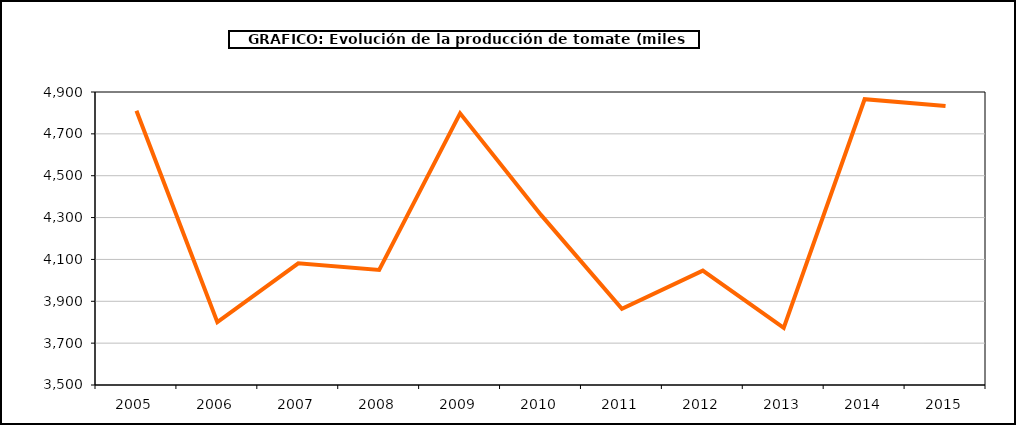
| Category | producción |
|---|---|
| 2005.0 | 4810.301 |
| 2006.0 | 3800.552 |
| 2007.0 | 4081.477 |
| 2008.0 | 4049.753 |
| 2009.0 | 4798.053 |
| 2010.0 | 4312.709 |
| 2011.0 | 3864.12 |
| 2012.0 | 4046.413 |
| 2013.0 | 3772.846 |
| 2014.0 | 4865.46 |
| 2015.0 | 4832.7 |